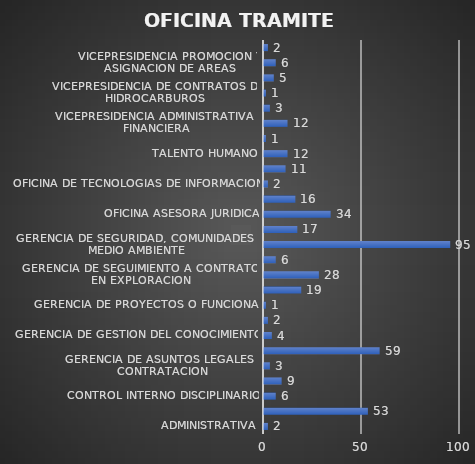
| Category | Series 0 |
|---|---|
| ADMINISTRATIVA | 2 |
| ATENCION CIUDADANA Y COMUNICACIONES | 53 |
| CONTROL INTERNO DISCIPLINARIO | 6 |
| FINANCIERA | 9 |
| GERENCIA DE ASUNTOS LEGALES Y CONTRATACION | 3 |
| GERENCIA DE GESTION DE LA INFORMACION TECNICA | 59 |
| GERENCIA DE GESTION DEL CONOCIMIENTO | 4 |
| GERENCIA DE PLANEACION | 2 |
| GERENCIA DE PROYECTOS O FUNCIONAL | 1 |
| GERENCIA DE RESERVAS Y OPERACIONES | 19 |
| GERENCIA DE SEGUIMIENTO A CONTRATOS EN EXPLORACION | 28 |
| GERENCIA DE SEGUIMIENTO A CONTRATOS EN PRODUCCION | 6 |
| GERENCIA DE SEGURIDAD, COMUNIDADES Y MEDIO AMBIENTE | 95 |
| GESTION DE REGALIAS Y DERECHOS ECONOMICOS | 17 |
| OFICINA ASESORA JURIDICA | 34 |
| OFICINA DE CONTROL INTERNO | 16 |
| OFICINA DE TECNOLOGIAS DE INFORMACION | 2 |
| PRESIDENCIA | 11 |
| TALENTO HUMANO | 12 |
| TESORERIA | 1 |
| VICEPRESIDENCIA ADMINISTRATIVA Y FINANCIERA | 12 |
| VICEPRESIDENCIA CONTRATOS DE HIDROCARBUROS | 3 |
| VICEPRESIDENCIA DE CONTRATOS DE HIDROCARBUROS | 1 |
| VICEPRESIDENCIA DE OPERACIONES, REGALIAS Y PARTICIPACIONES | 5 |
| VICEPRESIDENCIA PROMOCION Y ASIGNACION DE AREAS | 6 |
| VICEPRESIDENCIA TECNICA | 2 |